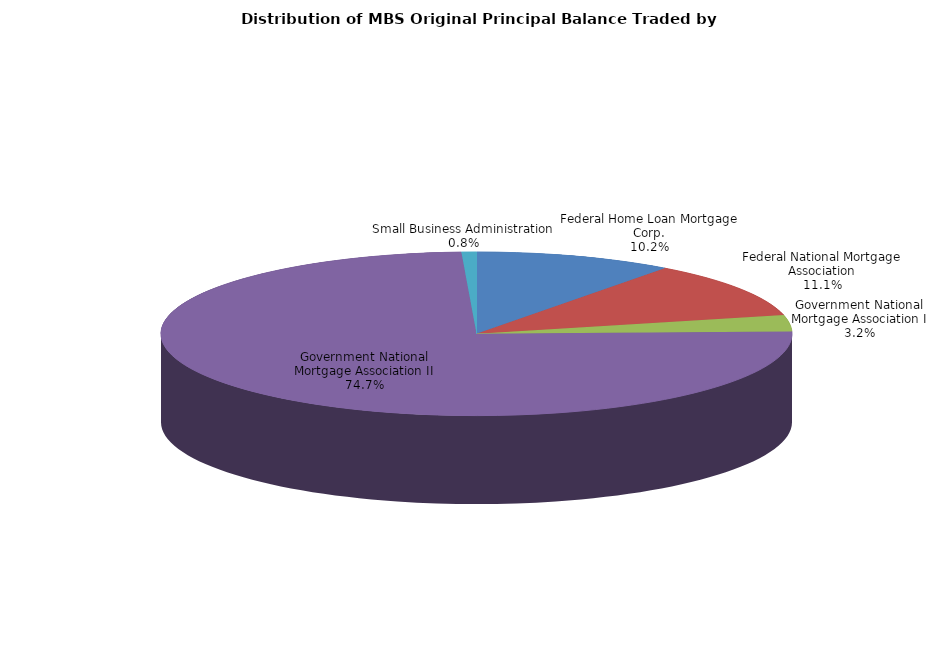
| Category | Series 0 |
|---|---|
| Federal Home Loan Mortgage Corp. | 695563161.2 |
| Federal National Mortgage Association | 760904745.36 |
| Government National Mortgage Association I | 221632552.702 |
| Government National Mortgage Association II | 5107012985.633 |
| Small Business Administration | 52376480.883 |